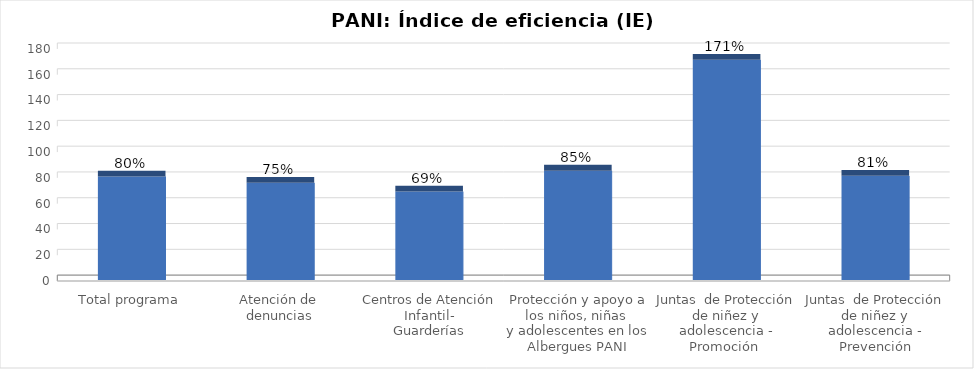
| Category | Índice de eficiencia (IE)  |
|---|---|
| Total programa | 80.167 |
| Atención de 
denuncias | 75.322 |
| Centros de Atención Infantil-
Guarderías | 68.527 |
| Protección y apoyo a los niños, niñas 
y adolescentes en los Albergues PANI | 84.672 |
| Juntas  de Protección de niñez y adolescencia - Promoción  | 170.671 |
| Juntas  de Protección de niñez y adolescencia - Prevención | 80.715 |